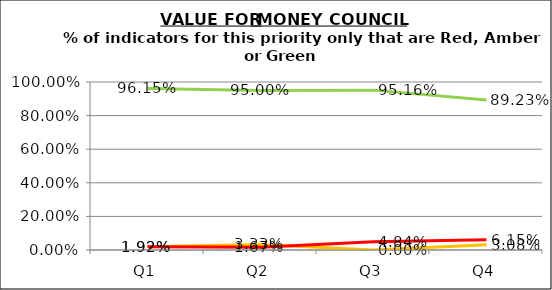
| Category | Green | Amber | Red |
|---|---|---|---|
| Q1 | 0.962 | 0.019 | 0.019 |
| Q2 | 0.95 | 0.033 | 0.017 |
| Q3 | 0.952 | 0 | 0.048 |
| Q4 | 0.892 | 0.031 | 0.062 |